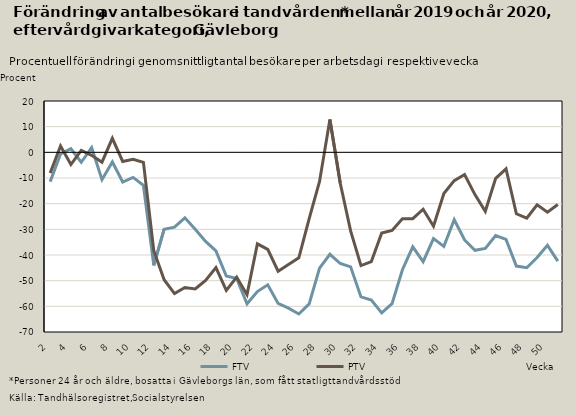
| Category | FTV | PTV |
|---|---|---|
| 2.0 | -11.404 | -8.085 |
| 3.0 | -0.654 | 2.456 |
| 4.0 | 1.408 | -4.752 |
| 5.0 | -3.864 | 0.799 |
| 6.0 | 1.847 | -1.151 |
| 7.0 | -10.644 | -3.823 |
| 8.0 | -3.717 | 5.474 |
| 9.0 | -11.572 | -3.541 |
| 10.0 | -9.772 | -2.731 |
| 11.0 | -12.835 | -3.918 |
| 12.0 | -44.062 | -38.307 |
| 13.0 | -29.938 | -49.634 |
| 14.0 | -29.137 | -55.052 |
| 15.0 | -25.53 | -52.692 |
| 16.0 | -29.984 | -53.232 |
| 17.0 | -34.697 | -49.905 |
| 18.0 | -38.431 | -44.904 |
| 19.0 | -48.172 | -53.782 |
| 20.0 | -49.175 | -48.632 |
| 21.0 | -59.026 | -55.445 |
| 22.0 | -54.261 | -35.665 |
| 23.0 | -51.617 | -37.842 |
| 24.0 | -58.879 | -46.318 |
| 25.0 | -60.717 | -43.728 |
| 26.0 | -62.975 | -41.093 |
| 27.0 | -59.051 | -25.858 |
| 28.0 | -45.117 | -11.36 |
| 29.0 | -39.718 | 12.78 |
| 30.0 | -43.325 | -12.052 |
| 31.0 | -44.612 | -30.602 |
| 32.0 | -56.312 | -44.128 |
| 33.0 | -57.584 | -42.553 |
| 34.0 | -62.568 | -31.467 |
| 35.0 | -58.992 | -30.451 |
| 36.0 | -45.724 | -25.844 |
| 37.0 | -36.833 | -25.83 |
| 38.0 | -42.584 | -22.161 |
| 39.0 | -33.617 | -28.785 |
| 40.0 | -36.638 | -16.043 |
| 41.0 | -26.276 | -11.023 |
| 42.0 | -34.14 | -8.647 |
| 43.0 | -38.185 | -16.475 |
| 44.0 | -37.437 | -22.979 |
| 45.0 | -32.402 | -10.137 |
| 46.0 | -33.924 | -6.453 |
| 47.0 | -44.305 | -23.938 |
| 48.0 | -44.953 | -25.63 |
| 49.0 | -40.992 | -20.473 |
| 50.0 | -36.246 | -23.335 |
| 51.0 | -42.371 | -20.343 |